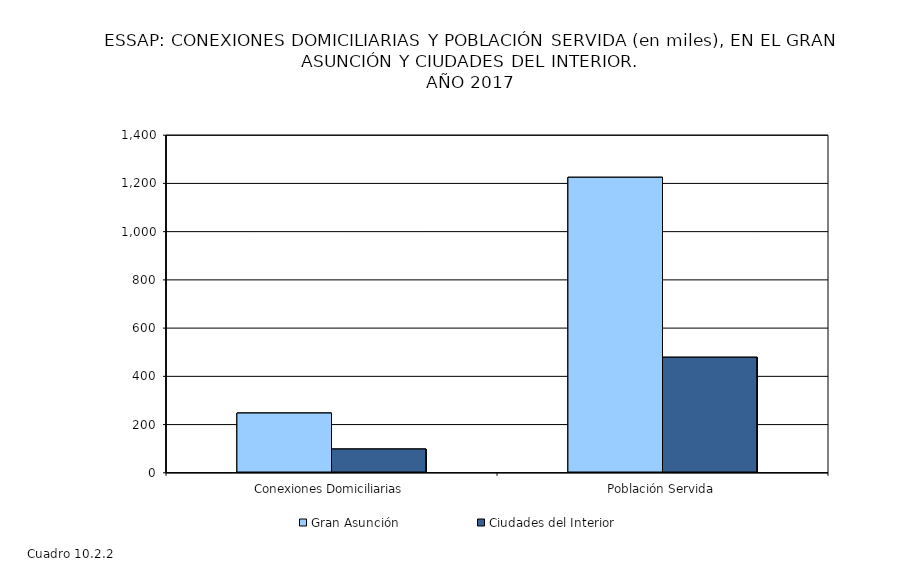
| Category | Gran Asunción | Ciudades del Interior |
|---|---|---|
| Conexiones Domiciliarias | 244.398 | 95.143 |
| Población Servida | 1221.99 | 475.715 |